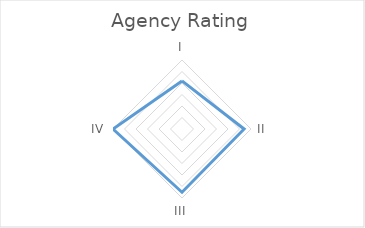
| Category | Series 0 |
|---|---|
| I | 2.091 |
| II | 2.7 |
| III | 2.75 |
| IV | 3 |